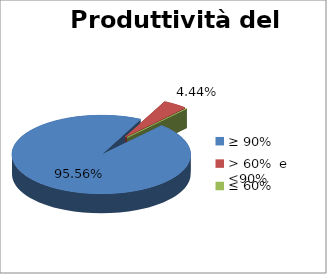
| Category | Produttività del personale |
|---|---|
| ≥ 90% | 0.956 |
| > 60%  e  <90% | 0.044 |
| ≤ 60% | 0 |